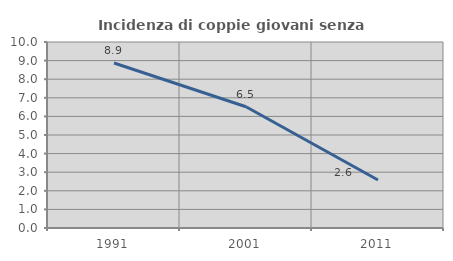
| Category | Incidenza di coppie giovani senza figli |
|---|---|
| 1991.0 | 8.871 |
| 2001.0 | 6.516 |
| 2011.0 | 2.582 |